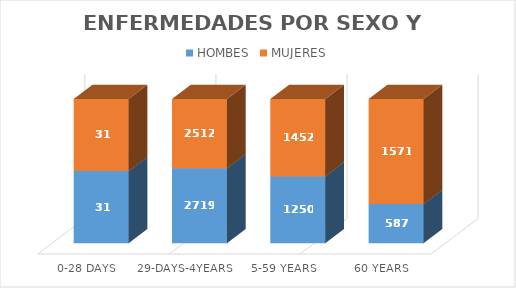
| Category | HOMBES | MUJERES |
|---|---|---|
| 0-28 Days | 31 | 31 |
| 29-days-4years | 2719 | 2512 |
| 5-59 years | 1250 | 1452 |
| 60 years | 587 | 1571 |